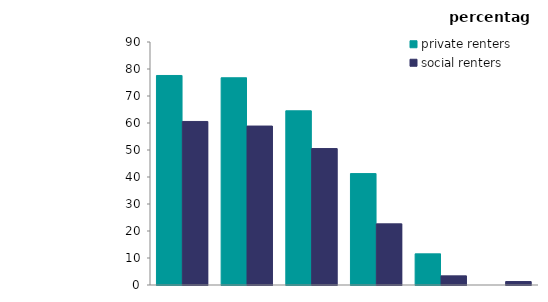
| Category | private renters | social renters |
|---|---|---|
| 16-24 | 77.604 | 60.571 |
| 25-34 | 76.752 | 58.867 |
| 35-44 | 64.517 | 50.534 |
| 45-64 | 41.259 | 22.649 |
| 65-74 | 11.545 | 3.391 |
| 75 or over | 0 | 1.279 |